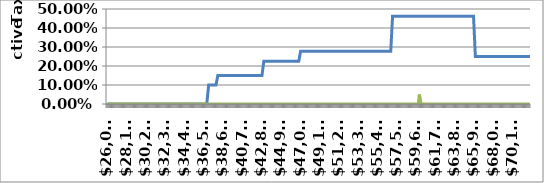
| Category | Single | MyIncome |
|---|---|---|
| 26021.0 | 0 | 0 |
| 26121.0 | 0 | 0 |
| 26221.0 | 0 | 0 |
| 26321.0 | 0 | 0 |
| 26421.0 | 0 | 0 |
| 26521.0 | 0 | 0 |
| 26621.0 | 0 | 0 |
| 26721.0 | 0 | 0 |
| 26821.0 | 0 | 0 |
| 26921.0 | 0 | 0 |
| 27021.0 | 0 | 0 |
| 27121.0 | 0 | 0 |
| 27221.0 | 0 | 0 |
| 27321.0 | 0 | 0 |
| 27421.0 | 0 | 0 |
| 27521.0 | 0 | 0 |
| 27621.0 | 0 | 0 |
| 27721.0 | 0 | 0 |
| 27821.0 | 0 | 0 |
| 27921.0 | 0 | 0 |
| 28021.0 | 0 | 0 |
| 28121.0 | 0 | 0 |
| 28221.0 | 0 | 0 |
| 28321.0 | 0 | 0 |
| 28421.0 | 0 | 0 |
| 28521.0 | 0 | 0 |
| 28621.0 | 0 | 0 |
| 28721.0 | 0 | 0 |
| 28821.0 | 0 | 0 |
| 28921.0 | 0 | 0 |
| 29021.0 | 0 | 0 |
| 29121.0 | 0 | 0 |
| 29221.0 | 0 | 0 |
| 29321.0 | 0 | 0 |
| 29421.0 | 0 | 0 |
| 29521.0 | 0 | 0 |
| 29621.0 | 0 | 0 |
| 29721.0 | 0 | 0 |
| 29821.0 | 0 | 0 |
| 29921.0 | 0 | 0 |
| 30021.0 | 0 | 0 |
| 30121.0 | 0 | 0 |
| 30221.0 | 0 | 0 |
| 30321.0 | 0 | 0 |
| 30421.0 | 0 | 0 |
| 30521.0 | 0 | 0 |
| 30621.0 | 0 | 0 |
| 30721.0 | 0 | 0 |
| 30821.0 | 0 | 0 |
| 30921.0 | 0 | 0 |
| 31021.0 | 0 | 0 |
| 31121.0 | 0 | 0 |
| 31221.0 | 0 | 0 |
| 31321.0 | 0 | 0 |
| 31421.0 | 0 | 0 |
| 31521.0 | 0 | 0 |
| 31621.0 | 0 | 0 |
| 31721.0 | 0 | 0 |
| 31821.0 | 0 | 0 |
| 31921.0 | 0 | 0 |
| 32021.0 | 0 | 0 |
| 32121.0 | 0 | 0 |
| 32221.0 | 0 | 0 |
| 32321.0 | 0 | 0 |
| 32421.0 | 0 | 0 |
| 32521.0 | 0 | 0 |
| 32621.0 | 0 | 0 |
| 32721.0 | 0 | 0 |
| 32821.0 | 0 | 0 |
| 32921.0 | 0 | 0 |
| 33021.0 | 0 | 0 |
| 33121.0 | 0 | 0 |
| 33221.0 | 0 | 0 |
| 33321.0 | 0 | 0 |
| 33421.0 | 0 | 0 |
| 33521.0 | 0 | 0 |
| 33621.0 | 0 | 0 |
| 33721.0 | 0 | 0 |
| 33821.0 | 0 | 0 |
| 33921.0 | 0 | 0 |
| 34021.0 | 0 | 0 |
| 34121.0 | 0 | 0 |
| 34221.0 | 0 | 0 |
| 34321.0 | 0 | 0 |
| 34421.0 | 0 | 0 |
| 34521.0 | 0 | 0 |
| 34621.0 | 0 | 0 |
| 34721.0 | 0 | 0 |
| 34821.0 | 0 | 0 |
| 34921.0 | 0 | 0 |
| 35021.0 | 0 | 0 |
| 35121.0 | 0 | 0 |
| 35221.0 | 0 | 0 |
| 35321.0 | 0 | 0 |
| 35421.0 | 0 | 0 |
| 35521.0 | 0 | 0 |
| 35621.0 | 0 | 0 |
| 35721.0 | 0 | 0 |
| 35821.0 | 0 | 0 |
| 35921.0 | 0 | 0 |
| 36021.0 | 0 | 0 |
| 36121.0 | 0 | 0 |
| 36221.0 | 0 | 0 |
| 36321.0 | 0 | 0 |
| 36421.0 | 0 | 0 |
| 36521.0 | 0 | 0 |
| 36621.0 | 0 | 0 |
| 36721.0 | 0 | 0 |
| 36821.0 | 0 | 0 |
| 36921.0 | 0 | 0 |
| 37021.0 | 0.1 | 0 |
| 37121.0 | 0.1 | 0 |
| 37221.0 | 0.1 | 0 |
| 37321.0 | 0.1 | 0 |
| 37421.0 | 0.1 | 0 |
| 37521.0 | 0.1 | 0 |
| 37621.0 | 0.1 | 0 |
| 37721.0 | 0.1 | 0 |
| 37821.0 | 0.1 | 0 |
| 37921.0 | 0.1 | 0 |
| 38021.0 | 0.15 | 0 |
| 38121.0 | 0.15 | 0 |
| 38221.0 | 0.15 | 0 |
| 38321.0 | 0.15 | 0 |
| 38421.0 | 0.15 | 0 |
| 38521.0 | 0.15 | 0 |
| 38621.0 | 0.15 | 0 |
| 38721.0 | 0.15 | 0 |
| 38821.0 | 0.15 | 0 |
| 38921.0 | 0.15 | 0 |
| 39021.0 | 0.15 | 0 |
| 39121.0 | 0.15 | 0 |
| 39221.0 | 0.15 | 0 |
| 39321.0 | 0.15 | 0 |
| 39421.0 | 0.15 | 0 |
| 39521.0 | 0.15 | 0 |
| 39621.0 | 0.15 | 0 |
| 39721.0 | 0.15 | 0 |
| 39821.0 | 0.15 | 0 |
| 39921.0 | 0.15 | 0 |
| 40021.0 | 0.15 | 0 |
| 40121.0 | 0.15 | 0 |
| 40221.0 | 0.15 | 0 |
| 40321.0 | 0.15 | 0 |
| 40421.0 | 0.15 | 0 |
| 40521.0 | 0.15 | 0 |
| 40621.0 | 0.15 | 0 |
| 40721.0 | 0.15 | 0 |
| 40821.0 | 0.15 | 0 |
| 40921.0 | 0.15 | 0 |
| 41021.0 | 0.15 | 0 |
| 41121.0 | 0.15 | 0 |
| 41221.0 | 0.15 | 0 |
| 41321.0 | 0.15 | 0 |
| 41421.0 | 0.15 | 0 |
| 41521.0 | 0.15 | 0 |
| 41621.0 | 0.15 | 0 |
| 41721.0 | 0.15 | 0 |
| 41821.0 | 0.15 | 0 |
| 41921.0 | 0.15 | 0 |
| 42021.0 | 0.15 | 0 |
| 42121.0 | 0.15 | 0 |
| 42221.0 | 0.15 | 0 |
| 42321.0 | 0.15 | 0 |
| 42421.0 | 0.15 | 0 |
| 42521.0 | 0.15 | 0 |
| 42621.0 | 0.15 | 0 |
| 42721.0 | 0.15 | 0 |
| 42821.0 | 0.15 | 0 |
| 42921.0 | 0.15 | 0 |
| 43021.0 | 0.225 | 0 |
| 43121.0 | 0.225 | 0 |
| 43221.0 | 0.225 | 0 |
| 43321.0 | 0.225 | 0 |
| 43421.0 | 0.225 | 0 |
| 43521.0 | 0.225 | 0 |
| 43621.0 | 0.225 | 0 |
| 43721.0 | 0.225 | 0 |
| 43821.0 | 0.225 | 0 |
| 43921.0 | 0.225 | 0 |
| 44021.0 | 0.225 | 0 |
| 44121.0 | 0.225 | 0 |
| 44221.0 | 0.225 | 0 |
| 44321.0 | 0.225 | 0 |
| 44421.0 | 0.225 | 0 |
| 44521.0 | 0.225 | 0 |
| 44621.0 | 0.225 | 0 |
| 44721.0 | 0.225 | 0 |
| 44821.0 | 0.225 | 0 |
| 44921.0 | 0.225 | 0 |
| 45021.0 | 0.225 | 0 |
| 45121.0 | 0.225 | 0 |
| 45221.0 | 0.225 | 0 |
| 45321.0 | 0.225 | 0 |
| 45421.0 | 0.225 | 0 |
| 45521.0 | 0.225 | 0 |
| 45621.0 | 0.225 | 0 |
| 45721.0 | 0.225 | 0 |
| 45821.0 | 0.225 | 0 |
| 45921.0 | 0.225 | 0 |
| 46021.0 | 0.225 | 0 |
| 46121.0 | 0.225 | 0 |
| 46221.0 | 0.225 | 0 |
| 46321.0 | 0.225 | 0 |
| 46421.0 | 0.225 | 0 |
| 46521.0 | 0.225 | 0 |
| 46621.0 | 0.225 | 0 |
| 46721.0 | 0.225 | 0 |
| 46821.0 | 0.225 | 0 |
| 46921.0 | 0.225 | 0 |
| 47021.0 | 0.278 | 0 |
| 47121.0 | 0.278 | 0 |
| 47221.0 | 0.278 | 0 |
| 47321.0 | 0.278 | 0 |
| 47421.0 | 0.278 | 0 |
| 47521.0 | 0.278 | 0 |
| 47621.0 | 0.278 | 0 |
| 47721.0 | 0.278 | 0 |
| 47821.0 | 0.278 | 0 |
| 47921.0 | 0.278 | 0 |
| 48021.0 | 0.278 | 0 |
| 48121.0 | 0.278 | 0 |
| 48221.0 | 0.278 | 0 |
| 48321.0 | 0.278 | 0 |
| 48421.0 | 0.278 | 0 |
| 48521.0 | 0.278 | 0 |
| 48621.0 | 0.278 | 0 |
| 48721.0 | 0.278 | 0 |
| 48821.0 | 0.278 | 0 |
| 48921.0 | 0.278 | 0 |
| 49021.0 | 0.278 | 0 |
| 49121.0 | 0.278 | 0 |
| 49221.0 | 0.278 | 0 |
| 49321.0 | 0.278 | 0 |
| 49421.0 | 0.278 | 0 |
| 49521.0 | 0.278 | 0 |
| 49621.0 | 0.278 | 0 |
| 49721.0 | 0.278 | 0 |
| 49821.0 | 0.278 | 0 |
| 49921.0 | 0.278 | 0 |
| 50021.0 | 0.278 | 0 |
| 50121.0 | 0.278 | 0 |
| 50221.0 | 0.278 | 0 |
| 50321.0 | 0.278 | 0 |
| 50421.0 | 0.278 | 0 |
| 50521.0 | 0.278 | 0 |
| 50621.0 | 0.278 | 0 |
| 50721.0 | 0.278 | 0 |
| 50821.0 | 0.278 | 0 |
| 50921.0 | 0.278 | 0 |
| 51021.0 | 0.278 | 0 |
| 51121.0 | 0.278 | 0 |
| 51221.0 | 0.278 | 0 |
| 51321.0 | 0.278 | 0 |
| 51421.0 | 0.278 | 0 |
| 51521.0 | 0.278 | 0 |
| 51621.0 | 0.278 | 0 |
| 51721.0 | 0.278 | 0 |
| 51821.0 | 0.278 | 0 |
| 51921.0 | 0.278 | 0 |
| 52021.0 | 0.278 | 0 |
| 52121.0 | 0.278 | 0 |
| 52221.0 | 0.278 | 0 |
| 52321.0 | 0.278 | 0 |
| 52421.0 | 0.278 | 0 |
| 52521.0 | 0.278 | 0 |
| 52621.0 | 0.278 | 0 |
| 52721.0 | 0.278 | 0 |
| 52821.0 | 0.278 | 0 |
| 52921.0 | 0.278 | 0 |
| 53021.0 | 0.278 | 0 |
| 53121.0 | 0.278 | 0 |
| 53221.0 | 0.278 | 0 |
| 53321.0 | 0.278 | 0 |
| 53421.0 | 0.278 | 0 |
| 53521.0 | 0.278 | 0 |
| 53621.0 | 0.278 | 0 |
| 53721.0 | 0.278 | 0 |
| 53821.0 | 0.278 | 0 |
| 53921.0 | 0.278 | 0 |
| 54021.0 | 0.278 | 0 |
| 54121.0 | 0.278 | 0 |
| 54221.0 | 0.278 | 0 |
| 54321.0 | 0.278 | 0 |
| 54421.0 | 0.278 | 0 |
| 54521.0 | 0.278 | 0 |
| 54621.0 | 0.278 | 0 |
| 54721.0 | 0.278 | 0 |
| 54821.0 | 0.278 | 0 |
| 54921.0 | 0.278 | 0 |
| 55021.0 | 0.278 | 0 |
| 55121.0 | 0.278 | 0 |
| 55221.0 | 0.278 | 0 |
| 55321.0 | 0.278 | 0 |
| 55421.0 | 0.278 | 0 |
| 55521.0 | 0.278 | 0 |
| 55621.0 | 0.278 | 0 |
| 55721.0 | 0.278 | 0 |
| 55821.0 | 0.278 | 0 |
| 55921.0 | 0.278 | 0 |
| 56021.0 | 0.278 | 0 |
| 56121.0 | 0.278 | 0 |
| 56221.0 | 0.278 | 0 |
| 56321.0 | 0.278 | 0 |
| 56421.0 | 0.278 | 0 |
| 56521.0 | 0.278 | 0 |
| 56621.0 | 0.278 | 0 |
| 56721.0 | 0.278 | 0 |
| 56821.0 | 0.278 | 0 |
| 56921.0 | 0.278 | 0 |
| 57021.0 | 0.462 | 0 |
| 57121.0 | 0.462 | 0 |
| 57221.0 | 0.462 | 0 |
| 57321.0 | 0.462 | 0 |
| 57421.0 | 0.462 | 0 |
| 57521.0 | 0.462 | 0 |
| 57621.0 | 0.462 | 0 |
| 57721.0 | 0.462 | 0 |
| 57821.0 | 0.462 | 0 |
| 57921.0 | 0.462 | 0 |
| 58021.0 | 0.462 | 0 |
| 58121.0 | 0.462 | 0 |
| 58221.0 | 0.462 | 0 |
| 58321.0 | 0.462 | 0 |
| 58421.0 | 0.462 | 0 |
| 58521.0 | 0.462 | 0 |
| 58621.0 | 0.462 | 0 |
| 58721.0 | 0.462 | 0 |
| 58821.0 | 0.462 | 0 |
| 58921.0 | 0.462 | 0 |
| 59021.0 | 0.462 | 0 |
| 59121.0 | 0.462 | 0 |
| 59221.0 | 0.462 | 0 |
| 59321.0 | 0.462 | 0 |
| 59421.0 | 0.462 | 0 |
| 59521.0 | 0.462 | 0 |
| 59621.0 | 0.462 | 0 |
| 59721.0 | 0.462 | 0 |
| 59821.0 | 0.462 | 0 |
| 59921.0 | 0.462 | 0.05 |
| 60021.0 | 0.462 | 0.05 |
| 60121.0 | 0.462 | 0 |
| 60221.0 | 0.462 | 0 |
| 60321.0 | 0.462 | 0 |
| 60421.0 | 0.462 | 0 |
| 60521.0 | 0.462 | 0 |
| 60621.0 | 0.462 | 0 |
| 60721.0 | 0.462 | 0 |
| 60821.0 | 0.462 | 0 |
| 60921.0 | 0.462 | 0 |
| 61021.0 | 0.462 | 0 |
| 61121.0 | 0.462 | 0 |
| 61221.0 | 0.462 | 0 |
| 61321.0 | 0.462 | 0 |
| 61421.0 | 0.462 | 0 |
| 61521.0 | 0.462 | 0 |
| 61621.0 | 0.462 | 0 |
| 61721.0 | 0.462 | 0 |
| 61821.0 | 0.462 | 0 |
| 61921.0 | 0.462 | 0 |
| 62021.0 | 0.462 | 0 |
| 62121.0 | 0.462 | 0 |
| 62221.0 | 0.462 | 0 |
| 62321.0 | 0.462 | 0 |
| 62421.0 | 0.462 | 0 |
| 62521.0 | 0.462 | 0 |
| 62621.0 | 0.462 | 0 |
| 62721.0 | 0.462 | 0 |
| 62821.0 | 0.462 | 0 |
| 62921.0 | 0.462 | 0 |
| 63021.0 | 0.462 | 0 |
| 63121.0 | 0.462 | 0 |
| 63221.0 | 0.462 | 0 |
| 63321.0 | 0.462 | 0 |
| 63421.0 | 0.462 | 0 |
| 63521.0 | 0.462 | 0 |
| 63621.0 | 0.462 | 0 |
| 63721.0 | 0.462 | 0 |
| 63821.0 | 0.462 | 0 |
| 63921.0 | 0.462 | 0 |
| 64021.0 | 0.462 | 0 |
| 64121.0 | 0.462 | 0 |
| 64221.0 | 0.462 | 0 |
| 64321.0 | 0.462 | 0 |
| 64421.0 | 0.462 | 0 |
| 64521.0 | 0.462 | 0 |
| 64621.0 | 0.462 | 0 |
| 64721.0 | 0.462 | 0 |
| 64821.0 | 0.462 | 0 |
| 64921.0 | 0.462 | 0 |
| 65021.0 | 0.462 | 0 |
| 65121.0 | 0.462 | 0 |
| 65221.0 | 0.462 | 0 |
| 65321.0 | 0.462 | 0 |
| 65421.0 | 0.462 | 0 |
| 65521.0 | 0.462 | 0 |
| 65621.0 | 0.462 | 0 |
| 65721.0 | 0.462 | 0 |
| 65821.0 | 0.462 | 0 |
| 65921.0 | 0.462 | 0 |
| 66021.0 | 0.25 | 0 |
| 66121.0 | 0.25 | 0 |
| 66221.0 | 0.25 | 0 |
| 66321.0 | 0.25 | 0 |
| 66421.0 | 0.25 | 0 |
| 66521.0 | 0.25 | 0 |
| 66621.0 | 0.25 | 0 |
| 66721.0 | 0.25 | 0 |
| 66821.0 | 0.25 | 0 |
| 66921.0 | 0.25 | 0 |
| 67021.0 | 0.25 | 0 |
| 67121.0 | 0.25 | 0 |
| 67221.0 | 0.25 | 0 |
| 67321.0 | 0.25 | 0 |
| 67421.0 | 0.25 | 0 |
| 67521.0 | 0.25 | 0 |
| 67621.0 | 0.25 | 0 |
| 67721.0 | 0.25 | 0 |
| 67821.0 | 0.25 | 0 |
| 67921.0 | 0.25 | 0 |
| 68021.0 | 0.25 | 0 |
| 68121.0 | 0.25 | 0 |
| 68221.0 | 0.25 | 0 |
| 68321.0 | 0.25 | 0 |
| 68421.0 | 0.25 | 0 |
| 68521.0 | 0.25 | 0 |
| 68621.0 | 0.25 | 0 |
| 68721.0 | 0.25 | 0 |
| 68821.0 | 0.25 | 0 |
| 68921.0 | 0.25 | 0 |
| 69021.0 | 0.25 | 0 |
| 69121.0 | 0.25 | 0 |
| 69221.0 | 0.25 | 0 |
| 69321.0 | 0.25 | 0 |
| 69421.0 | 0.25 | 0 |
| 69521.0 | 0.25 | 0 |
| 69621.0 | 0.25 | 0 |
| 69721.0 | 0.25 | 0 |
| 69821.0 | 0.25 | 0 |
| 69921.0 | 0.25 | 0 |
| 70021.0 | 0.25 | 0 |
| 70121.0 | 0.25 | 0 |
| 70221.0 | 0.25 | 0 |
| 70321.0 | 0.25 | 0 |
| 70421.0 | 0.25 | 0 |
| 70521.0 | 0.25 | 0 |
| 70621.0 | 0.25 | 0 |
| 70721.0 | 0.25 | 0 |
| 70821.0 | 0.25 | 0 |
| 70921.0 | 0.25 | 0 |
| 71021.0 | 0.25 | 0 |
| 71121.0 | 0.25 | 0 |
| 71221.0 | 0.25 | 0 |
| 71321.0 | 0.25 | 0 |
| 71421.0 | 0.25 | 0 |
| 71521.0 | 0.25 | 0 |
| 71621.0 | 0.25 | 0 |
| 71721.0 | 0.25 | 0 |
| 71821.0 | 0.25 | 0 |
| 71921.0 | 0.25 | 0 |
| 72021.0 | 0.25 | 0 |